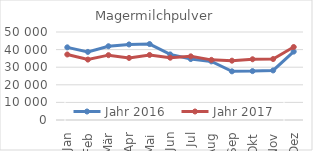
| Category | Jahr 2016 | Jahr 2017 |
|---|---|---|
| Jan | 41282.035 | 37228.144 |
| Feb | 38696.584 | 34334.312 |
| Mär | 41913.906 | 36846.749 |
| Apr | 42930.637 | 35274.582 |
| Mai | 43160.874 | 36952.634 |
| Jun | 37266.083 | 35395.47 |
| Jul | 34623.836 | 36166.036 |
| Aug | 33296.962 | 34163.451 |
| Sep | 27647.636 | 33700.819 |
| Okt | 27775.251 | 34516.025 |
| Nov | 28162.694 | 34643.547 |
| Dez | 38872.842 | 41468.664 |